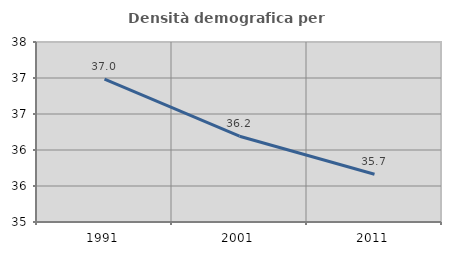
| Category | Densità demografica |
|---|---|
| 1991.0 | 36.984 |
| 2001.0 | 36.191 |
| 2011.0 | 35.663 |